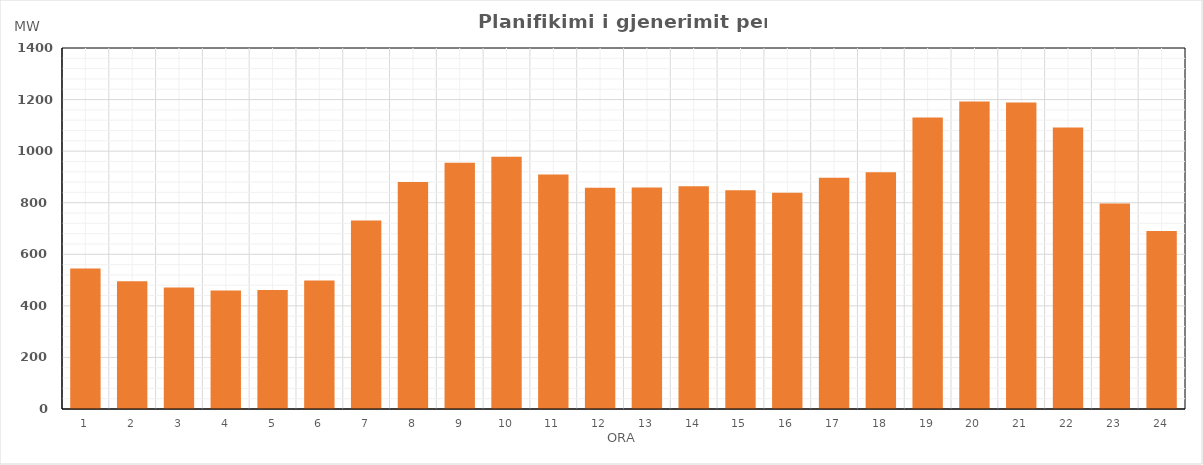
| Category | Max (MW) |
|---|---|
| 0 | 544.7 |
| 1 | 495.19 |
| 2 | 470.79 |
| 3 | 459.18 |
| 4 | 461.79 |
| 5 | 498.54 |
| 6 | 730.9 |
| 7 | 880.15 |
| 8 | 955.47 |
| 9 | 977.86 |
| 10 | 909.15 |
| 11 | 858.06 |
| 12 | 858.76 |
| 13 | 863.48 |
| 14 | 848.37 |
| 15 | 838.61 |
| 16 | 896.6 |
| 17 | 918.42 |
| 18 | 1130.3 |
| 19 | 1192.92 |
| 20 | 1188.81 |
| 21 | 1091.75 |
| 22 | 796.75 |
| 23 | 690.71 |